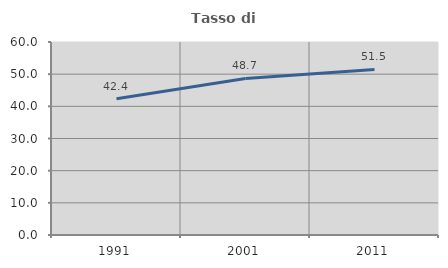
| Category | Tasso di occupazione   |
|---|---|
| 1991.0 | 42.356 |
| 2001.0 | 48.664 |
| 2011.0 | 51.456 |